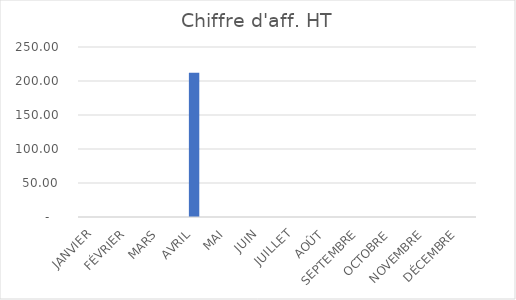
| Category | Chiffre d'aff. HT |
|---|---|
| JANVIER | 0 |
| FÉVRIER | 0 |
| MARS | 0 |
| AVRIL | 212 |
| MAI | 0 |
| JUIN | 0 |
| JUILLET | 0 |
| AOÛT | 0 |
| SEPTEMBRE | 0 |
| OCTOBRE | 0 |
| NOVEMBRE | 0 |
| DÉCEMBRE | 0 |